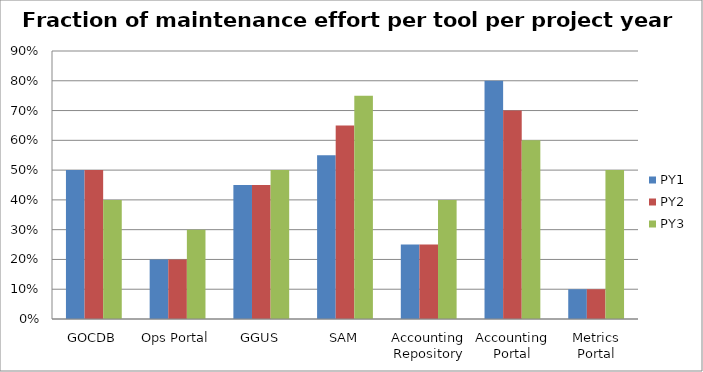
| Category | PY1 | PY2 | PY3 |
|---|---|---|---|
| GOCDB | 0.5 | 0.5 | 0.4 |
| Ops Portal | 0.2 | 0.2 | 0.3 |
| GGUS | 0.45 | 0.45 | 0.5 |
| SAM | 0.55 | 0.65 | 0.75 |
| Accounting Repository | 0.25 | 0.25 | 0.4 |
| Accounting Portal | 0.8 | 0.7 | 0.6 |
| Metrics Portal | 0.1 | 0.1 | 0.5 |